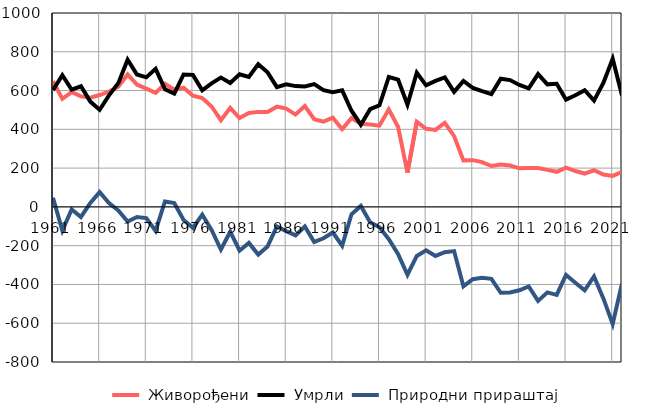
| Category |  Живорођени |  Умрли |  Природни прираштај |
|---|---|---|---|
| 1961.0 | 649 | 602 | 47 |
| 1962.0 | 557 | 679 | -122 |
| 1963.0 | 592 | 605 | -13 |
| 1964.0 | 570 | 622 | -52 |
| 1965.0 | 563 | 543 | 20 |
| 1966.0 | 577 | 501 | 76 |
| 1967.0 | 595 | 575 | 20 |
| 1968.0 | 620 | 638 | -18 |
| 1969.0 | 683 | 759 | -76 |
| 1970.0 | 631 | 683 | -52 |
| 1971.0 | 610 | 668 | -58 |
| 1972.0 | 588 | 712 | -124 |
| 1973.0 | 635 | 607 | 28 |
| 1974.0 | 604 | 584 | 20 |
| 1975.0 | 615 | 683 | -68 |
| 1976.0 | 573 | 681 | -108 |
| 1977.0 | 561 | 601 | -40 |
| 1978.0 | 518 | 637 | -119 |
| 1979.0 | 447 | 667 | -220 |
| 1980.0 | 511 | 639 | -128 |
| 1981.0 | 458 | 684 | -226 |
| 1982.0 | 484 | 670 | -186 |
| 1983.0 | 490 | 736 | -246 |
| 1984.0 | 490 | 694 | -204 |
| 1985.0 | 517 | 618 | -101 |
| 1986.0 | 507 | 632 | -125 |
| 1987.0 | 476 | 623 | -147 |
| 1988.0 | 520 | 621 | -101 |
| 1989.0 | 452 | 633 | -181 |
| 1990.0 | 440 | 602 | -162 |
| 1991.0 | 460 | 592 | -132 |
| 1992.0 | 401 | 601 | -200 |
| 1993.0 | 458 | 496 | -38 |
| 1994.0 | 429 | 424 | 5 |
| 1995.0 | 425 | 504 | -79 |
| 1996.0 | 419 | 524 | -105 |
| 1997.0 | 503 | 670 | -167 |
| 1998.0 | 412 | 656 | -244 |
| 1999.0 | 177 | 527 | -350 |
| 2000.0 | 439 | 692 | -253 |
| 2001.0 | 403 | 627 | -224 |
| 2002.0 | 397 | 650 | -253 |
| 2003.0 | 434 | 668 | -234 |
| 2004.0 | 365 | 593 | -228 |
| 2005.0 | 240 | 650 | -410 |
| 2006.0 | 241 | 614 | -373 |
| 2007.0 | 231 | 597 | -366 |
| 2008.0 | 211 | 582 | -371 |
| 2009.0 | 218 | 661 | -443 |
| 2010.0 | 213 | 654 | -441 |
| 2011.0 | 199 | 629 | -430 |
| 2012.0 | 201 | 611 | -410 |
| 2013.0 | 200 | 685 | -485 |
| 2014.0 | 191 | 632 | -441 |
| 2015.0 | 181 | 635 | -454 |
| 2016.0 | 202 | 553 | -351 |
| 2017.0 | 185 | 576 | -391 |
| 2018.0 | 172 | 602 | -430 |
| 2019.0 | 189 | 548 | -359 |
| 2020.0 | 167 | 639 | -472 |
| 2021.0 | 160 | 764 | -604 |
| 2022.0 | 180 | 575 | -395 |